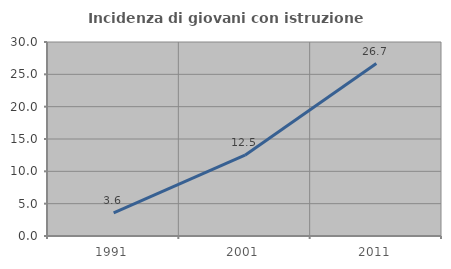
| Category | Incidenza di giovani con istruzione universitaria |
|---|---|
| 1991.0 | 3.571 |
| 2001.0 | 12.5 |
| 2011.0 | 26.667 |